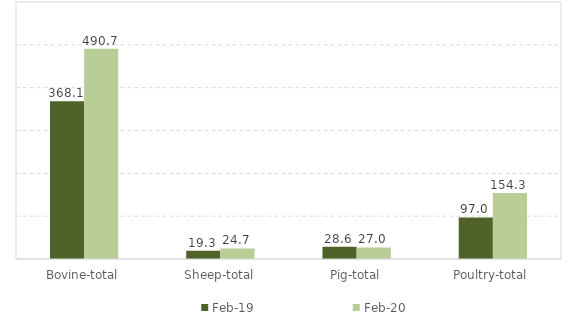
| Category | Feb-19 | Feb-20 |
|---|---|---|
| Bovine-total | 368.1 | 490.7 |
| Sheep-total | 19.3 | 24.7 |
| Pig-total | 28.6 | 27 |
| Poultry-total | 97 | 154.3 |